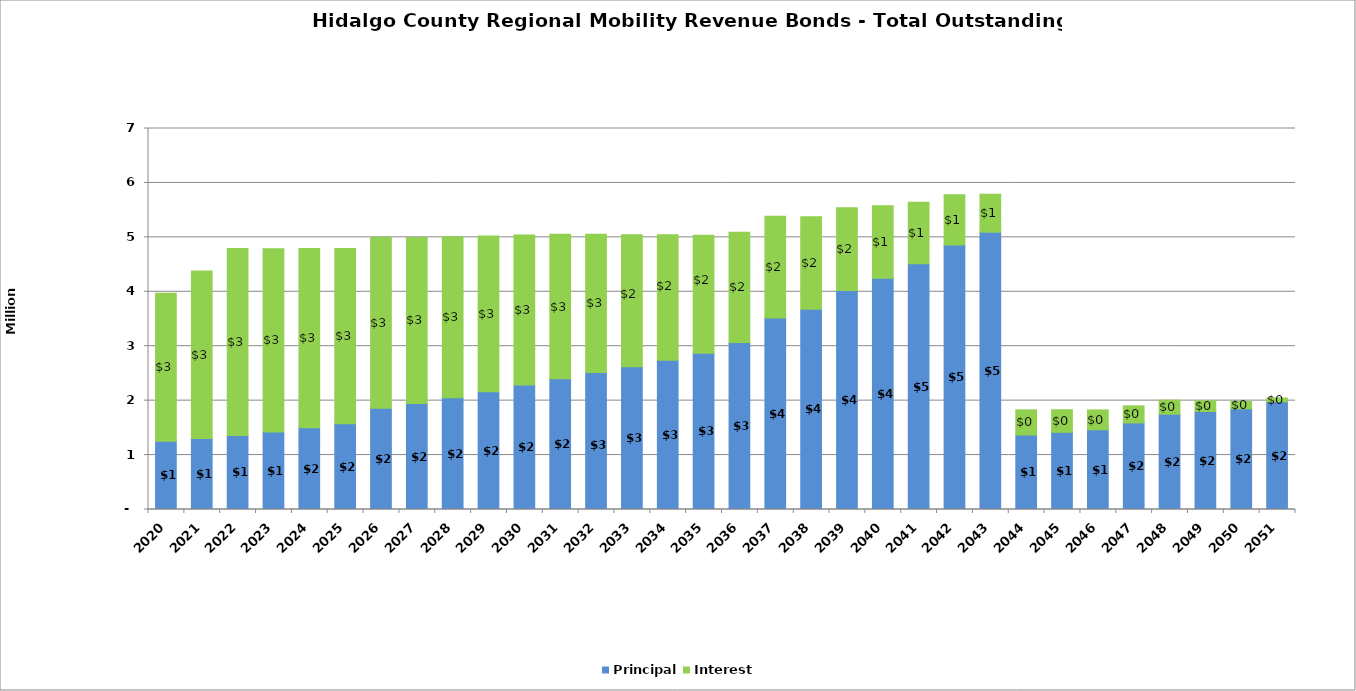
| Category | Principal | Interest |
|---|---|---|
| 2020.0 | 1255000 | 2718318 |
| 2021.0 | 1305000 | 3077218 |
| 2022.0 | 1360000 | 3434125 |
| 2023.0 | 1425000 | 3366125 |
| 2024.0 | 1500000 | 3294875 |
| 2025.0 | 1575000 | 3219875 |
| 2026.0 | 1860000 | 3141125 |
| 2027.0 | 1947000 | 3051275 |
| 2028.0 | 2052000 | 2957105 |
| 2029.0 | 2165000 | 2857985 |
| 2030.0 | 2289000 | 2753560 |
| 2031.0 | 2400000 | 2658408 |
| 2032.0 | 2515000 | 2542983 |
| 2033.0 | 2625000 | 2421958 |
| 2034.0 | 2740000 | 2307034 |
| 2035.0 | 2870000 | 2168958 |
| 2036.0 | 3070000 | 2024058 |
| 2037.0 | 3520000 | 1869884 |
| 2038.0 | 3679000 | 1697508 |
| 2039.0 | 4025000 | 1516943 |
| 2040.0 | 4250000 | 1329343 |
| 2041.0 | 4515000 | 1131543 |
| 2042.0 | 4859000 | 921993 |
| 2043.0 | 5095000 | 697853 |
| 2044.0 | 1369000 | 462753 |
| 2045.0 | 1418000 | 414838 |
| 2046.0 | 1465000 | 365208 |
| 2047.0 | 1590000 | 313933 |
| 2048.0 | 1750000 | 258283 |
| 2049.0 | 1800000 | 197033 |
| 2050.0 | 1850000 | 134033 |
| 2051.0 | 1979510 | 69279 |